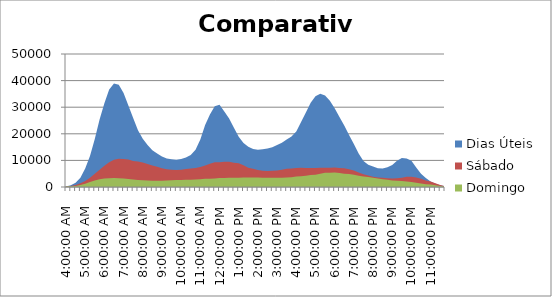
| Category | Dias Úteis | Sábado | Domingo |
|---|---|---|---|
| 0.16666666666666663 | 209.4 | 157 | 151 |
| 0.1770833333333333 | 683.4 | 417 | 248 |
| 0.18749999999999994 | 1642.4 | 747 | 382 |
| 0.1979166666666666 | 3453.6 | 1388 | 788 |
| 0.20833333333333326 | 6952.6 | 2297 | 1255 |
| 0.21874999999999992 | 11670 | 3520 | 1865 |
| 0.22916666666666657 | 18073.4 | 4939 | 2467 |
| 0.23958333333333323 | 25400.8 | 6516 | 2938 |
| 0.2499999999999999 | 31501.4 | 7944 | 3149 |
| 0.2604166666666666 | 36690.2 | 9280 | 3304 |
| 0.27083333333333326 | 38952.8 | 10250 | 3391 |
| 0.28124999999999994 | 38430.6 | 10617 | 3285 |
| 0.29166666666666663 | 35334.4 | 10527 | 3216 |
| 0.3020833333333333 | 30659.6 | 10317 | 2988 |
| 0.3125 | 25903 | 9821 | 2842 |
| 0.3229166666666667 | 21328.4 | 9553 | 2656 |
| 0.33333333333333337 | 18184.6 | 9181 | 2579 |
| 0.34375000000000006 | 15804.8 | 8603 | 2462 |
| 0.35416666666666674 | 13809.8 | 8128 | 2378 |
| 0.3645833333333334 | 12576.6 | 7607 | 2371 |
| 0.3750000000000001 | 11475.4 | 7075 | 2396 |
| 0.3854166666666668 | 10731 | 6642 | 2453 |
| 0.3958333333333335 | 10473.6 | 6455 | 2542 |
| 0.40625000000000017 | 10284.2 | 6345 | 2621 |
| 0.41666666666666685 | 10510.4 | 6528 | 2654 |
| 0.42708333333333354 | 11051.6 | 6754 | 2685 |
| 0.4375000000000002 | 12064 | 6992 | 2689 |
| 0.4479166666666669 | 14024.6 | 7137 | 2788 |
| 0.4583333333333336 | 17886.2 | 7472 | 2888 |
| 0.4687500000000003 | 23288 | 8109 | 3059 |
| 0.47916666666666696 | 27248.4 | 8767 | 3124 |
| 0.48958333333333365 | 30350.6 | 9316 | 3166 |
| 0.5000000000000003 | 30941.6 | 9340 | 3338 |
| 0.510416666666667 | 28407.2 | 9449 | 3377 |
| 0.5208333333333336 | 25797.6 | 9512 | 3480 |
| 0.5312500000000002 | 22321 | 9072 | 3499 |
| 0.5416666666666669 | 18920.2 | 8903 | 3491 |
| 0.5520833333333335 | 16499 | 8166 | 3534 |
| 0.5625000000000001 | 15115.2 | 7220 | 3528 |
| 0.5729166666666667 | 14321.4 | 6875 | 3599 |
| 0.5833333333333334 | 14005.4 | 6434 | 3534 |
| 0.59375 | 14209.4 | 6097 | 3467 |
| 0.6041666666666666 | 14432.6 | 6001 | 3483 |
| 0.6145833333333333 | 14989.6 | 6099 | 3483 |
| 0.6249999999999999 | 15776.8 | 6218 | 3514 |
| 0.6354166666666665 | 16656.6 | 6521 | 3501 |
| 0.6458333333333331 | 17871.4 | 6852 | 3534 |
| 0.6562499999999998 | 18952 | 6942 | 3663 |
| 0.6666666666666664 | 20824.6 | 7130 | 3926 |
| 0.677083333333333 | 24449.6 | 7208 | 4088 |
| 0.6874999999999997 | 27963.4 | 7155 | 4243 |
| 0.6979166666666663 | 31700.6 | 7169 | 4510 |
| 0.7083333333333329 | 34088.8 | 7184 | 4598 |
| 0.7187499999999996 | 35010.2 | 7265 | 4992 |
| 0.7291666666666662 | 34391.8 | 7220 | 5394 |
| 0.7395833333333328 | 32386.6 | 7228 | 5337 |
| 0.7499999999999994 | 29626 | 7288 | 5429 |
| 0.7604166666666661 | 26338.8 | 7119 | 5310 |
| 0.7708333333333327 | 23150.6 | 7032 | 5028 |
| 0.7812499999999993 | 19537.6 | 6678 | 4897 |
| 0.791666666666666 | 16140 | 6204 | 4597 |
| 0.8020833333333326 | 12611.2 | 5463 | 4236 |
| 0.8124999999999992 | 9773 | 4775 | 3983 |
| 0.8229166666666659 | 8339.2 | 4306 | 3715 |
| 0.8333333333333325 | 7677 | 3838 | 3435 |
| 0.8437499999999991 | 7062.2 | 3591 | 3182 |
| 0.8541666666666657 | 6961.6 | 3502 | 2876 |
| 0.8645833333333324 | 7437.8 | 3273 | 2680 |
| 0.874999999999999 | 8235.2 | 3150 | 2421 |
| 0.8854166666666656 | 9840 | 3309 | 2324 |
| 0.8958333333333323 | 10927.2 | 3512 | 2259 |
| 0.9062499999999989 | 10733.8 | 3855 | 2041 |
| 0.9166666666666655 | 9877.8 | 3895 | 1846 |
| 0.9270833333333321 | 7369.6 | 3582 | 1630 |
| 0.9374999999999988 | 5014.2 | 3134 | 1328 |
| 0.9479166666666654 | 3392.2 | 2472 | 1076 |
| 0.958333333333332 | 2080.8 | 2037 | 943 |
| 0.9687499999999987 | 1212.2 | 1377 | 612 |
| 0.9791666666666653 | 675.6 | 770 | 343 |
| 0.9895833333333319 | 268.2 | 311 | 162 |